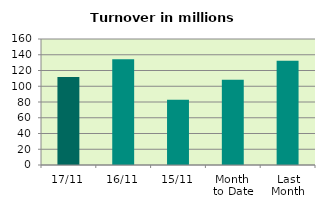
| Category | Series 0 |
|---|---|
| 17/11 | 111.673 |
| 16/11 | 134.297 |
| 15/11 | 82.863 |
| Month 
to Date | 108.115 |
| Last
Month | 132.268 |